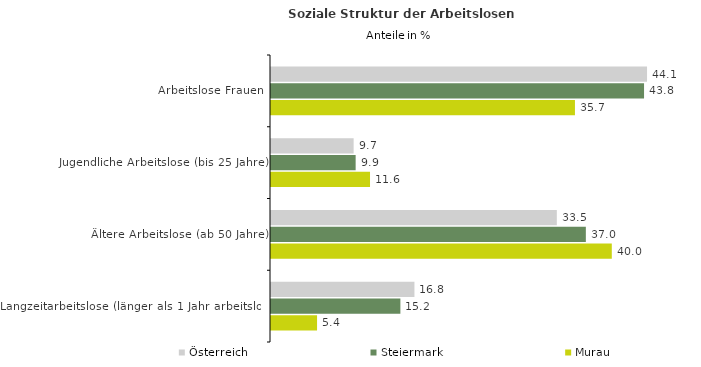
| Category | Österreich | Steiermark | Murau |
|---|---|---|---|
| Arbeitslose Frauen | 44.136 | 43.785 | 35.676 |
| Jugendliche Arbeitslose (bis 25 Jahre) | 9.698 | 9.935 | 11.622 |
| Ältere Arbeitslose (ab 50 Jahre) | 33.548 | 36.954 | 40 |
| Langzeitarbeitslose (länger als 1 Jahr arbeitslos) | 16.836 | 15.186 | 5.405 |